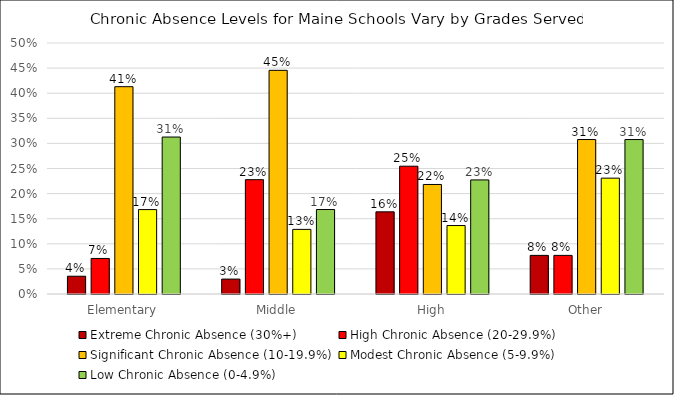
| Category | Extreme Chronic Absence (30%+) | High Chronic Absence (20-29.9%) | Significant Chronic Absence (10-19.9%) | Modest Chronic Absence (5-9.9%) | Low Chronic Absence (0-4.9%) |
|---|---|---|---|---|---|
| Elementary | 0.035 | 0.071 | 0.413 | 0.168 | 0.313 |
| Middle | 0.03 | 0.228 | 0.446 | 0.129 | 0.168 |
| High | 0.164 | 0.255 | 0.218 | 0.136 | 0.227 |
| Other | 0.077 | 0.077 | 0.308 | 0.231 | 0.308 |